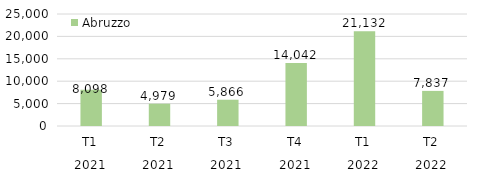
| Category | Abruzzo |
|---|---|
| 0 | 8097.711 |
| 1 | 4978.78 |
| 2 | 5865.63 |
| 3 | 14042.38 |
| 4 | 21131.544 |
| 5 | 7837 |